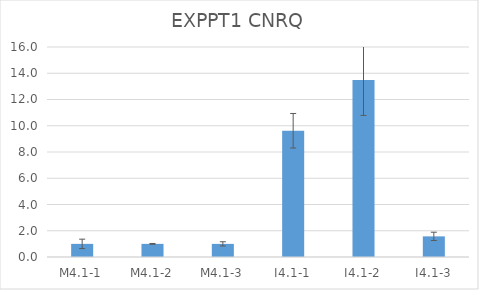
| Category | EXPPT1 CNRQ |
|---|---|
| M4.1-1 | 1 |
| M4.1-2 | 1 |
| M4.1-3 | 1 |
| I4.1-1 | 9.619 |
| I4.1-2 | 13.481 |
| I4.1-3 | 1.572 |